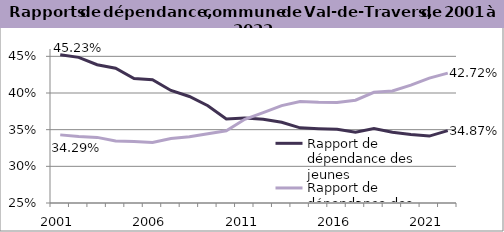
| Category | Rapport de dépendance des jeunes | Rapport de dépendance des personnes âgées |
|---|---|---|
| 2001.0 | 0.452 | 0.343 |
| 2002.0 | 0.449 | 0.341 |
| 2003.0 | 0.439 | 0.339 |
| 2004.0 | 0.434 | 0.335 |
| 2005.0 | 0.42 | 0.334 |
| 2006.0 | 0.418 | 0.332 |
| 2007.0 | 0.403 | 0.338 |
| 2008.0 | 0.395 | 0.34 |
| 2009.0 | 0.383 | 0.345 |
| 2010.0 | 0.365 | 0.348 |
| 2011.0 | 0.366 | 0.364 |
| 2012.0 | 0.364 | 0.373 |
| 2013.0 | 0.36 | 0.383 |
| 2014.0 | 0.352 | 0.388 |
| 2015.0 | 0.351 | 0.387 |
| 2016.0 | 0.35 | 0.387 |
| 2017.0 | 0.347 | 0.39 |
| 2018.0 | 0.352 | 0.401 |
| 2019.0 | 0.347 | 0.403 |
| 2020.0 | 0.344 | 0.411 |
| 2021.0 | 0.341 | 0.42 |
| 2022.0 | 0.349 | 0.427 |